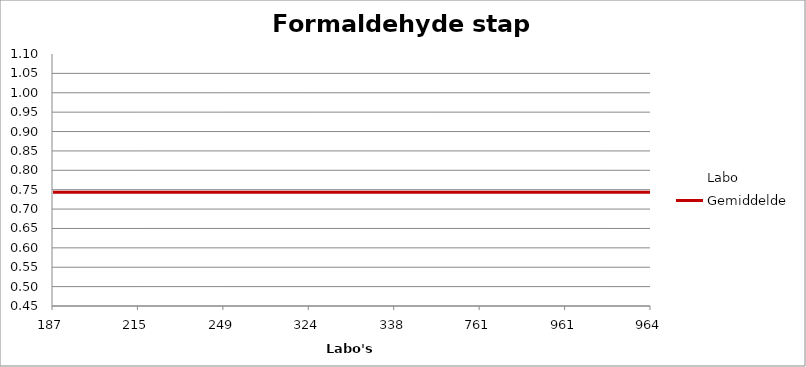
| Category | Labo | Gemiddelde |
|---|---|---|
| 187.0 | 0.816 | 0.743 |
| 215.0 | 0.801 | 0.743 |
| 249.0 | 0.786 | 0.743 |
| 324.0 | 0.498 | 0.743 |
| 338.0 | 0.706 | 0.743 |
| 761.0 | 0.647 | 0.743 |
| 961.0 | 0 | 0.743 |
| 964.0 | 0.94 | 0.743 |